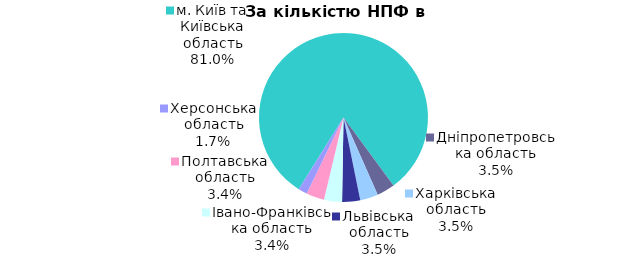
| Category | Series 0 |
|---|---|
| м. Київ та Київська область | 0.81 |
| Дніпропетровська область | 0.034 |
| Харківська область | 0.034 |
| Львівська область | 0.034 |
| Iвано-Франкiвська область | 0.034 |
| Полтавська область | 0.034 |
| Херсонська область | 0.017 |